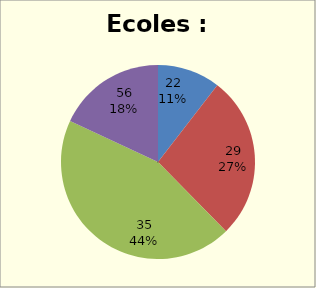
| Category | Ecoles |
|---|---|
| 22.0 | 69 |
| 29.0 | 179 |
| 35.0 | 292 |
| 56.0 | 119 |